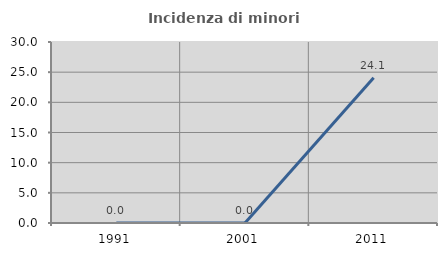
| Category | Incidenza di minori stranieri |
|---|---|
| 1991.0 | 0 |
| 2001.0 | 0 |
| 2011.0 | 24.074 |